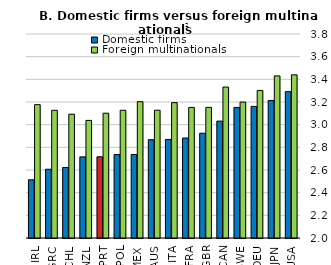
| Category | Domestic firms | Foreign multinationals |
|---|---|---|
| IRL | 2.513 | 3.176 |
| GRC | 2.607 | 3.127 |
| CHL | 2.622 | 3.092 |
| NZL | 2.716 | 3.038 |
| PRT | 2.716 | 3.101 |
| POL | 2.737 | 3.127 |
| MEX | 2.737 | 3.203 |
| AUS | 2.868 | 3.128 |
| ITA | 2.87 | 3.194 |
| FRA | 2.882 | 3.152 |
| GBR | 2.924 | 3.153 |
| CAN | 3.031 | 3.332 |
| SWE | 3.152 | 3.199 |
| DEU | 3.161 | 3.302 |
| JPN | 3.214 | 3.43 |
| USA | 3.291 | 3.44 |